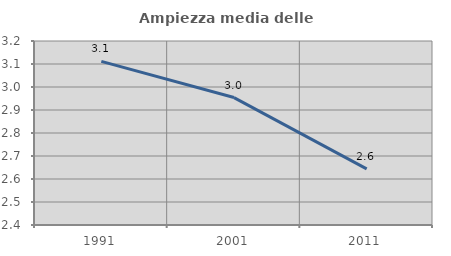
| Category | Ampiezza media delle famiglie |
|---|---|
| 1991.0 | 3.111 |
| 2001.0 | 2.954 |
| 2011.0 | 2.644 |